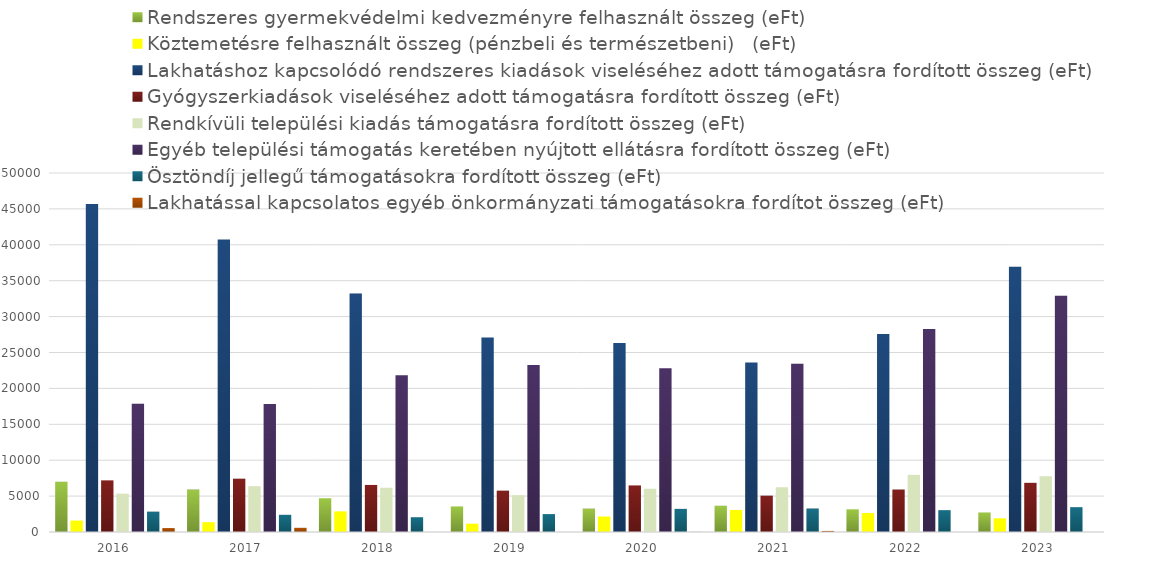
| Category | Rendszeres gyermekvédelmi kedvezményre felhasznált összeg (eFt) | Köztemetésre felhasznált összeg (pénzbeli és természetbeni)   (eFt) | Lakhatáshoz kapcsolódó rendszeres kiadások viseléséhez adott támogatásra fordított összeg (eFt) | Gyógyszerkiadások viseléséhez adott támogatásra fordított összeg (eFt) | Rendkívüli települési kiadás támogatásra fordított összeg (eFt) | Egyéb települési támogatás keretében nyújtott ellátásra fordított összeg (eFt) | Ösztöndíj jellegű támogatásokra fordított összeg (eFt) | Lakhatással kapcsolatos egyéb önkormányzati támogatásokra fordítot összeg (eFt) |
|---|---|---|---|---|---|---|---|---|
| 2016.0 | 6995 | 1595 | 45668 | 7192 | 5343 | 17851 | 2835 | 550 |
| 2017.0 | 5911 | 1366 | 40749 | 7424 | 6378 | 17833 | 2392 | 582 |
| 2018.0 | 4700 | 2872 | 33202 | 6554 | 6163 | 21844 | 2060 | 0 |
| 2019.0 | 3565 | 1160 | 27100 | 5759 | 5126 | 23264 | 2495 | 0 |
| 2020.0 | 3252 | 2154 | 26325 | 6487 | 6024 | 22799 | 3220 | 15 |
| 2021.0 | 3652 | 3070 | 23608 | 5062 | 6231 | 23419 | 3270 | 150 |
| 2022.0 | 3161 | 2642 | 27560 | 5913 | 7959 | 28262 | 3045 | 0 |
| 2023.0 | 2724 | 1905 | 36955 | 6849 | 7766 | 32914 | 3460 | 0 |